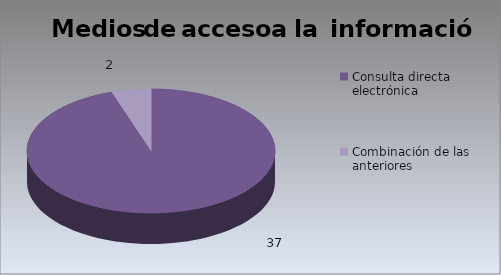
| Category | Series 0 |
|---|---|
| Consulta directa electrónica | 37 |
| Combinación de las anteriores | 2 |